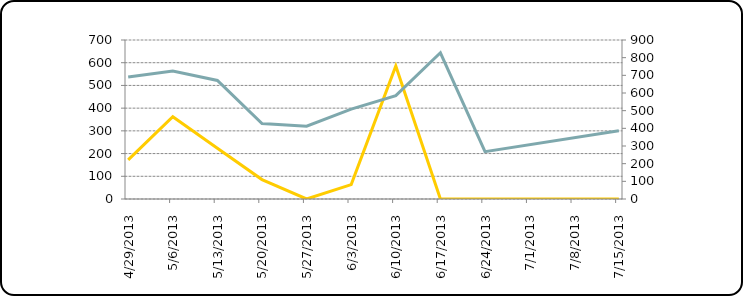
| Category | Series 0 |
|---|---|
| 4/29/13 | 172.488 |
| 5/6/13 | 362.455 |
| 5/13/13 | 223.69 |
| 5/20/13 | 85.462 |
| 5/27/13 | 0 |
| 6/3/13 | 63.565 |
| 6/10/13 | 585.44 |
| 6/17/13 | 0 |
| 6/24/13 | 0 |
| 7/15/13 | 0 |